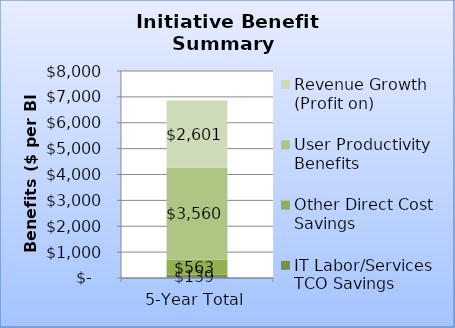
| Category | IT Labor/Services TCO Savings | Other Direct Cost Savings | User Productivity Benefits | Revenue Growth (Profit on) |
|---|---|---|---|---|
| 5-Year Total | 139.358 | 562.899 | 3560.142 | 2600.736 |